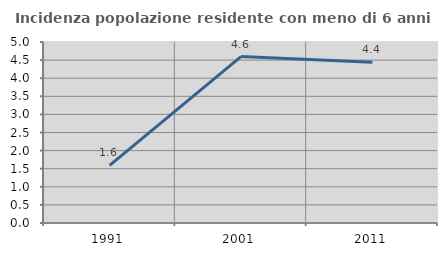
| Category | Incidenza popolazione residente con meno di 6 anni |
|---|---|
| 1991.0 | 1.591 |
| 2001.0 | 4.596 |
| 2011.0 | 4.439 |